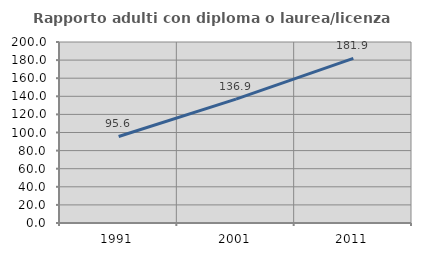
| Category | Rapporto adulti con diploma o laurea/licenza media  |
|---|---|
| 1991.0 | 95.609 |
| 2001.0 | 136.92 |
| 2011.0 | 181.892 |